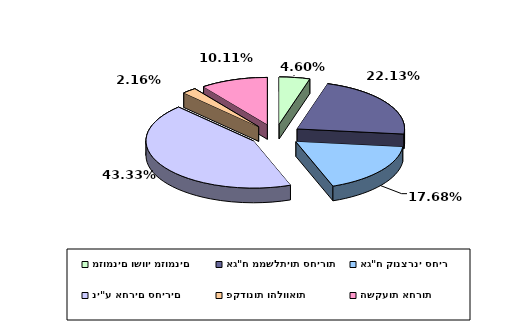
| Category | Series 0 |
|---|---|
| מזומנים ושווי מזומנים | 0.046 |
| אג"ח ממשלתיות סחירות | 0.221 |
| אג"ח קונצרני סחיר | 0.177 |
| ני"ע אחרים סחירים | 0.433 |
| פקדונות והלוואות | 0.022 |
| השקעות אחרות | 0.101 |